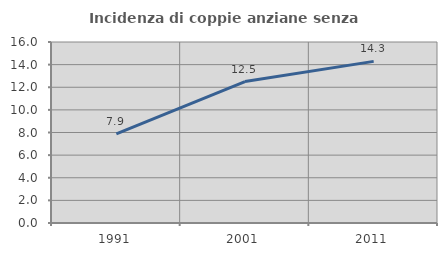
| Category | Incidenza di coppie anziane senza figli  |
|---|---|
| 1991.0 | 7.874 |
| 2001.0 | 12.5 |
| 2011.0 | 14.286 |